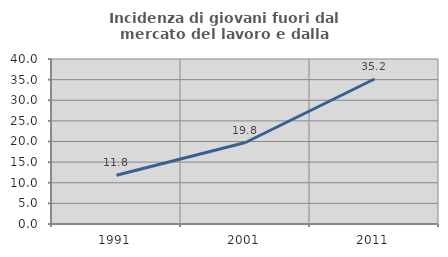
| Category | Incidenza di giovani fuori dal mercato del lavoro e dalla formazione  |
|---|---|
| 1991.0 | 11.801 |
| 2001.0 | 19.753 |
| 2011.0 | 35.156 |